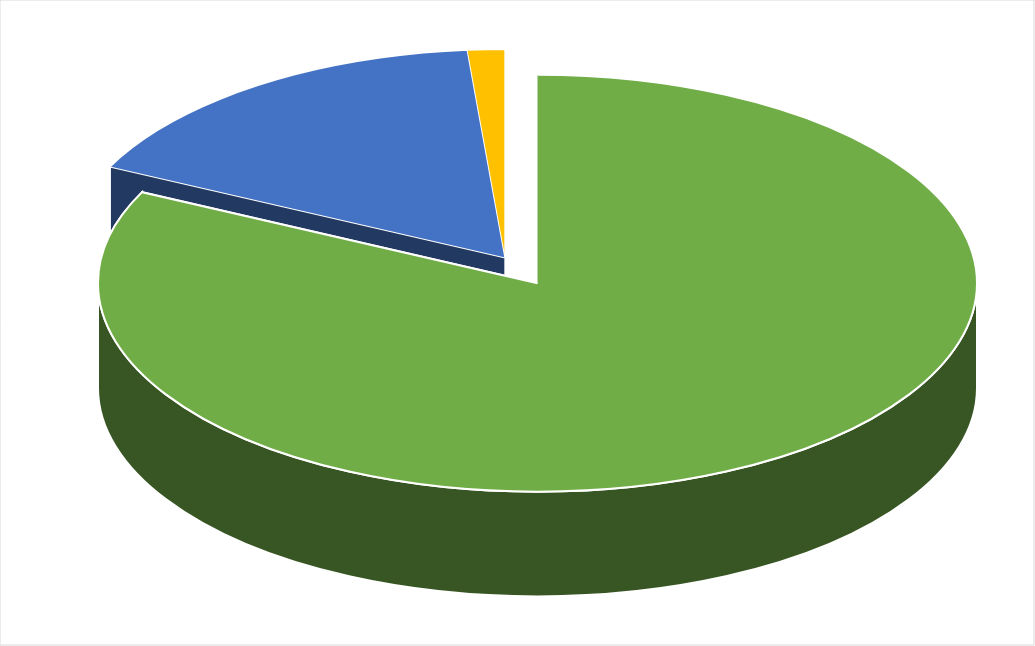
| Category | Total |
|---|---|
| Suma de MONTO OTORGADO2 | 3832338685.64 |
| SEG PUB 20% TOTAL | 766467785.728 |
| Suma de MONTO EJERCIDO2 | 63938445.562 |